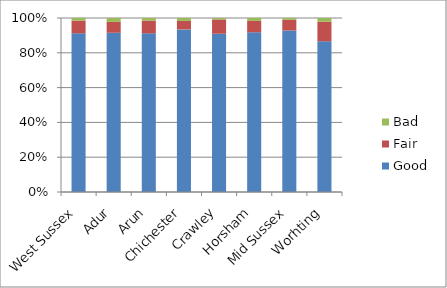
| Category | Good | Fair | Bad |
|---|---|---|---|
| West Sussex | 4398 | 352 | 73 |
| Adur | 410 | 28 | 10 |
| Arun | 796 | 64 | 13 |
| Chichester | 557 | 29 | 10 |
| Crawley | 765 | 69 | 7 |
| Horsham | 603 | 43 | 11 |
| Mid Sussex | 711 | 47 | 8 |
| Worhting | 556 | 72 | 14 |